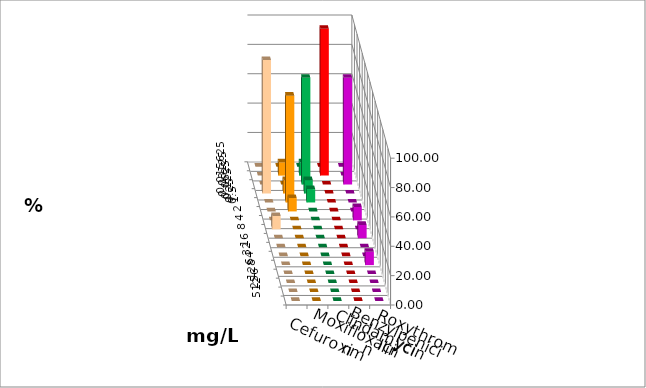
| Category | Cefuroxim | Moxifloxacin | Clindamycin | Benzylpenicillin | Roxythromycin |
|---|---|---|---|---|---|
| 0.015625 | 0 | 0 | 0 | 0 | 0 |
| 0.03125 | 0 | 9.091 | 9.091 | 100 | 0 |
| 0.0625 | 0 | 0 | 72.727 | 0 | 72.727 |
| 0.125 | 90.909 | 9.091 | 9.091 | 0 | 0 |
| 0.25 | 0 | 72.727 | 9.091 | 0 | 0 |
| 0.5 | 0 | 9.091 | 0 | 0 | 0 |
| 1.0 | 0 | 0 | 0 | 0 | 9.091 |
| 2.0 | 9.091 | 0 | 0 | 0 | 0 |
| 4.0 | 0 | 0 | 0 | 0 | 9.091 |
| 8.0 | 0 | 0 | 0 | 0 | 0 |
| 16.0 | 0 | 0 | 0 | 0 | 0 |
| 32.0 | 0 | 0 | 0 | 0 | 9.091 |
| 64.0 | 0 | 0 | 0 | 0 | 0 |
| 128.0 | 0 | 0 | 0 | 0 | 0 |
| 256.0 | 0 | 0 | 0 | 0 | 0 |
| 512.0 | 0 | 0 | 0 | 0 | 0 |